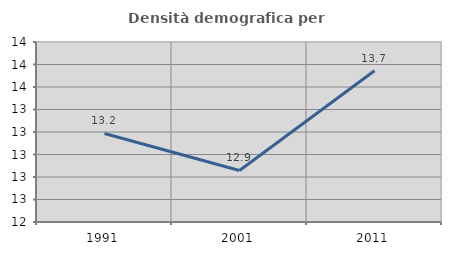
| Category | Densità demografica |
|---|---|
| 1991.0 | 13.187 |
| 2001.0 | 12.858 |
| 2011.0 | 13.744 |